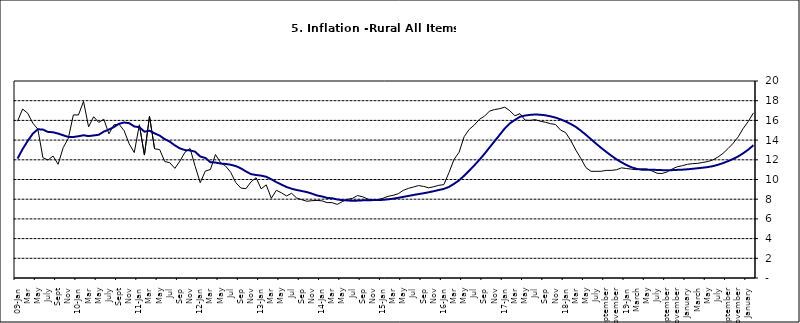
| Category | Series 0 | Series 1 |
|---|---|---|
| 09-Jan | 15.918 | 12.128 |
| Feb | 17.154 | 13.086 |
| Mar | 16.729 | 13.912 |
| Apr | 15.727 | 14.644 |
| May | 15.113 | 15.104 |
| June | 12.213 | 15.067 |
| July | 11.974 | 14.832 |
| Aug | 12.38 | 14.796 |
| Sept | 11.548 | 14.661 |
| Oct | 13.242 | 14.488 |
| Nov | 14.164 | 14.321 |
|  | 16.557 | 14.316 |
| 10-Jan | 16.548 | 14.39 |
| Feb | 17.934 | 14.494 |
| Mar | 15.346 | 14.401 |
| Apr | 16.373 | 14.473 |
| May | 15.794 | 14.54 |
| June | 16.126 | 14.862 |
| July | 14.634 | 15.072 |
| Aug | 15.556 | 15.33 |
| Sept | 15.616 | 15.658 |
| Oct | 14.955 | 15.786 |
| Nov | 13.616 | 15.719 |
| Dec | 12.735 | 15.385 |
| 11-Jan | 15.553 | 15.311 |
| Feb | 12.482 | 14.856 |
| Mar | 16.422 | 14.956 |
| Apr | 13.117 | 14.687 |
| May | 13.041 | 14.457 |
| Jun | 11.83 | 14.095 |
| Jul | 11.699 | 13.84 |
| Aug | 11.13 | 13.464 |
| Sep | 11.878 | 13.156 |
| Oct | 12.778 | 12.985 |
| Nov | 13.147 | 12.95 |
| Dec | 11.326 | 12.824 |
| 12-Jan | 9.678 | 12.33 |
| Feb | 10.856 | 12.188 |
| Mar | 11.014 | 11.76 |
| Apr | 12.536 | 11.724 |
| May | 11.712 | 11.621 |
| Jun | 11.36 | 11.582 |
| Jul | 10.733 | 11.499 |
| Aug | 9.683 | 11.368 |
| Sep | 9.132 | 11.131 |
| Oct | 9.071 | 10.82 |
| Nov | 9.758 | 10.548 |
| Dec | 10.183 | 10.455 |
| 13-Jan | 9.052 | 10.394 |
| Feb | 9.457 | 10.276 |
| Mar | 8.091 | 10.025 |
| Apr | 8.907 | 9.732 |
| May | 8.647 | 9.483 |
| Jun | 8.333 | 9.236 |
| Jul | 8.6 | 9.063 |
| Aug | 8.12 | 8.933 |
| Sep | 7.95 | 8.832 |
| Oct | 7.791 | 8.722 |
| Nov | 7.849 | 8.565 |
| Dec | 7.879 | 8.378 |
| 14-Jan | 7.832 | 8.277 |
| Feb | 7.657 | 8.13 |
| Mar | 7.65 | 8.092 |
| Apr | 7.473 | 7.973 |
| May | 7.761 | 7.901 |
| Jun | 7.98 | 7.874 |
| Jul | 8.086 | 7.834 |
| Aug | 8.368 | 7.858 |
| Sep | 8.244 | 7.883 |
| Oct | 8.019 | 7.903 |
| Nov | 7.898 | 7.906 |
| Dec | 7.955 | 7.913 |
| 15-Jan | 8.094 | 7.935 |
| Feb | 8.291 | 7.988 |
| Mar | 8.396 | 8.05 |
| Apr | 8.556 | 8.14 |
| May | 8.896 | 8.236 |
| Jun | 9.098 | 8.331 |
| Jul | 9.238 | 8.429 |
| Aug | 9.382 | 8.516 |
| Sep | 9.3 | 8.606 |
| Oct | 9.162 | 8.7 |
| Nov | 9.261 | 8.813 |
| Dec | 9.41 | 8.933 |
| 16-Jan | 9.48 | 9.047 |
| Feb | 10.692 | 9.249 |
| Mar | 12.038 | 9.559 |
| Apr | 12.767 | 9.917 |
| May | 14.349 | 10.384 |
| Jun | 15.088 | 10.897 |
| Jul | 15.533 | 11.433 |
| Aug | 16.103 | 12.002 |
| Sep | 16.428 | 12.601 |
| Oct | 16.947 | 13.25 |
| Nov | 17.099 | 13.898 |
| Dec | 17.195 | 14.54 |
| 17-Jan | 17.341 | 15.183 |
| Feb | 16.982 | 15.696 |
| Mar | 16.466 | 16.054 |
| Apr | 16.687 | 16.369 |
| May | 16.023 | 16.497 |
| Jun | 16.007 | 16.563 |
| Jul | 16.078 | 16.6 |
| Aug | 15.914 | 16.577 |
| Sep | 15.812 | 16.52 |
| Oct | 15.666 | 16.411 |
| Nov | 15.587 | 16.285 |
| Dec | 15.018 | 16.104 |
| 18-Jan | 14.756 | 15.892 |
| Feb | 13.957 | 15.638 |
| Mar | 12.987 | 15.339 |
| Apr | 12.126 | 14.95 |
| May | 11.199 | 14.53 |
| June | 10.832 | 14.083 |
| July | 10.831 | 13.636 |
| August | 10.838 | 13.209 |
| September | 10.924 | 12.804 |
| October | 10.927 | 12.418 |
| November | 10.986 | 12.049 |
| December | 11.183 | 11.746 |
| 19-Jan | 11.115 | 11.462 |
| February | 11.048 | 11.234 |
| March | 10.99 | 11.078 |
| April | 11.08 | 10.997 |
| May | 11.075 | 10.988 |
| June | 10.874 | 10.99 |
| July | 10.636 | 10.972 |
| August | 10.609 | 10.951 |
| September | 10.771 | 10.937 |
| October | 11.074 | 10.95 |
| November | 11.296 | 10.977 |
| December | 11.406 | 10.998 |
| January | 11.543 | 11.037 |
| February | 11.606 | 11.086 |
| March | 11.639 | 11.141 |
| April | 11.728 | 11.197 |
| May | 11.826 | 11.261 |
| June | 11.988 | 11.355 |
| July | 12.28 | 11.493 |
| August | 12.651 | 11.664 |
| September | 13.14 | 11.864 |
| October | 13.68 | 12.086 |
| November | 14.335 | 12.346 |
| December | 15.2 | 12.67 |
| January | 15.918 | 13.043 |
| February | 16.766 | 13.482 |